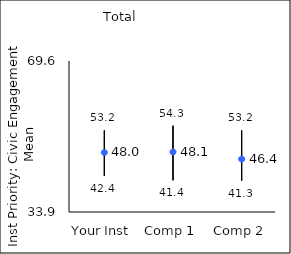
| Category | 25th percentile | 75th percentile | Mean |
|---|---|---|---|
| Your Inst | 42.4 | 53.2 | 47.97 |
| Comp 1 | 41.4 | 54.3 | 48.1 |
| Comp 2 | 41.3 | 53.2 | 46.41 |